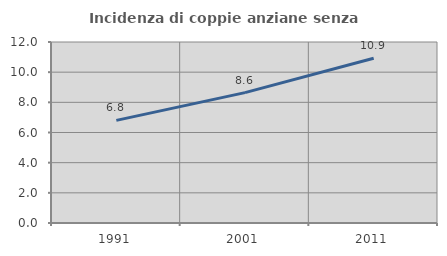
| Category | Incidenza di coppie anziane senza figli  |
|---|---|
| 1991.0 | 6.804 |
| 2001.0 | 8.642 |
| 2011.0 | 10.919 |